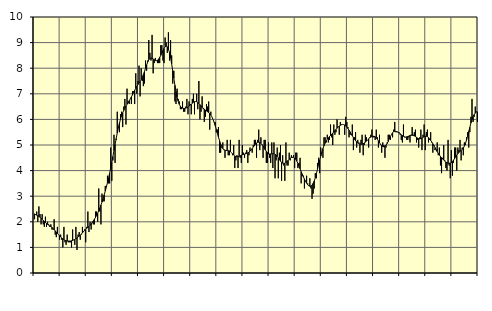
| Category | Piggar | Series 1 |
|---|---|---|
| nan | 2.1 | 2.31 |
| 87.0 | 2.3 | 2.28 |
| 87.0 | 2.4 | 2.26 |
| 87.0 | 2 | 2.24 |
| 87.0 | 2.6 | 2.21 |
| 87.0 | 2.3 | 2.18 |
| 87.0 | 1.9 | 2.14 |
| 87.0 | 2.3 | 2.1 |
| 87.0 | 1.9 | 2.05 |
| 87.0 | 1.8 | 2.01 |
| 87.0 | 2.2 | 1.97 |
| 87.0 | 1.8 | 1.93 |
| nan | 2 | 1.9 |
| 88.0 | 1.9 | 1.87 |
| 88.0 | 1.8 | 1.84 |
| 88.0 | 1.9 | 1.81 |
| 88.0 | 1.7 | 1.78 |
| 88.0 | 1.7 | 1.74 |
| 88.0 | 2.1 | 1.69 |
| 88.0 | 1.5 | 1.65 |
| 88.0 | 1.4 | 1.6 |
| 88.0 | 1.8 | 1.55 |
| 88.0 | 1.5 | 1.5 |
| 88.0 | 1.3 | 1.45 |
| nan | 1.5 | 1.41 |
| 89.0 | 1.3 | 1.37 |
| 89.0 | 1 | 1.33 |
| 89.0 | 1.8 | 1.3 |
| 89.0 | 1.2 | 1.28 |
| 89.0 | 1.1 | 1.26 |
| 89.0 | 1.5 | 1.25 |
| 89.0 | 1.2 | 1.25 |
| 89.0 | 1.2 | 1.25 |
| 89.0 | 1.2 | 1.25 |
| 89.0 | 1 | 1.26 |
| 89.0 | 1.7 | 1.27 |
| nan | 1.3 | 1.29 |
| 90.0 | 1.1 | 1.31 |
| 90.0 | 1.8 | 1.34 |
| 90.0 | 0.9 | 1.37 |
| 90.0 | 1.5 | 1.41 |
| 90.0 | 1.6 | 1.44 |
| 90.0 | 1.3 | 1.48 |
| 90.0 | 1.5 | 1.52 |
| 90.0 | 1.8 | 1.57 |
| 90.0 | 1.6 | 1.62 |
| 90.0 | 1.7 | 1.67 |
| 90.0 | 1.2 | 1.71 |
| nan | 1.8 | 1.75 |
| 91.0 | 2.4 | 1.78 |
| 91.0 | 1.6 | 1.82 |
| 91.0 | 2 | 1.86 |
| 91.0 | 1.7 | 1.91 |
| 91.0 | 2 | 1.97 |
| 91.0 | 1.9 | 2.03 |
| 91.0 | 1.9 | 2.1 |
| 91.0 | 2.4 | 2.17 |
| 91.0 | 2.4 | 2.25 |
| 91.0 | 2 | 2.34 |
| 91.0 | 3.3 | 2.43 |
| nan | 2.4 | 2.54 |
| 92.0 | 1.9 | 2.65 |
| 92.0 | 3.1 | 2.77 |
| 92.0 | 2.8 | 2.9 |
| 92.0 | 2.8 | 3.05 |
| 92.0 | 3.4 | 3.2 |
| 92.0 | 3.4 | 3.36 |
| 92.0 | 3.8 | 3.53 |
| 92.0 | 3.5 | 3.71 |
| 92.0 | 3.5 | 3.9 |
| 92.0 | 4.9 | 4.11 |
| 92.0 | 3.6 | 4.32 |
| nan | 4.4 | 4.55 |
| 93.0 | 5.4 | 4.78 |
| 93.0 | 4.3 | 5.02 |
| 93.0 | 5.2 | 5.25 |
| 93.0 | 6.3 | 5.47 |
| 93.0 | 5.7 | 5.67 |
| 93.0 | 5.5 | 5.85 |
| 93.0 | 6.2 | 6.01 |
| 93.0 | 6.3 | 6.14 |
| 93.0 | 5.7 | 6.26 |
| 93.0 | 6.5 | 6.35 |
| 93.0 | 6.8 | 6.44 |
| nan | 5.8 | 6.52 |
| 94.0 | 7.2 | 6.59 |
| 94.0 | 6.7 | 6.66 |
| 94.0 | 6.6 | 6.73 |
| 94.0 | 6.8 | 6.8 |
| 94.0 | 6.6 | 6.88 |
| 94.0 | 7.1 | 6.96 |
| 94.0 | 7.1 | 7.05 |
| 94.0 | 6.6 | 7.13 |
| 94.0 | 7.8 | 7.22 |
| 94.0 | 7 | 7.29 |
| 94.0 | 7.5 | 7.36 |
| nan | 8.1 | 7.42 |
| 95.0 | 6.9 | 7.48 |
| 95.0 | 8 | 7.55 |
| 95.0 | 7.5 | 7.64 |
| 95.0 | 7.3 | 7.75 |
| 95.0 | 7.4 | 7.87 |
| 95.0 | 8.3 | 8 |
| 95.0 | 7.9 | 8.13 |
| 95.0 | 8.3 | 8.24 |
| 95.0 | 9.1 | 8.33 |
| 95.0 | 8.6 | 8.38 |
| 95.0 | 8.3 | 8.4 |
| nan | 9.3 | 8.39 |
| 96.0 | 7.8 | 8.36 |
| 96.0 | 8.2 | 8.33 |
| 96.0 | 8.4 | 8.3 |
| 96.0 | 8.3 | 8.29 |
| 96.0 | 8.2 | 8.31 |
| 96.0 | 8.2 | 8.35 |
| 96.0 | 8.2 | 8.42 |
| 96.0 | 8.9 | 8.5 |
| 96.0 | 8.9 | 8.59 |
| 96.0 | 8.3 | 8.69 |
| 96.0 | 8.2 | 8.77 |
| nan | 9.2 | 8.84 |
| 97.0 | 9 | 8.86 |
| 97.0 | 8.6 | 8.84 |
| 97.0 | 9.4 | 8.75 |
| 97.0 | 8.3 | 8.61 |
| 97.0 | 9.1 | 8.41 |
| 97.0 | 8.5 | 8.17 |
| 97.0 | 7.4 | 7.89 |
| 97.0 | 7.9 | 7.61 |
| 97.0 | 6.7 | 7.33 |
| 97.0 | 6.6 | 7.08 |
| 97.0 | 7.2 | 6.87 |
| nan | 6.8 | 6.71 |
| 98.0 | 6.7 | 6.59 |
| 98.0 | 6.4 | 6.51 |
| 98.0 | 6.4 | 6.47 |
| 98.0 | 6.7 | 6.44 |
| 98.0 | 6.3 | 6.43 |
| 98.0 | 6.3 | 6.43 |
| 98.0 | 6.5 | 6.44 |
| 98.0 | 6.8 | 6.46 |
| 98.0 | 6.2 | 6.48 |
| 98.0 | 6.7 | 6.52 |
| 98.0 | 6.6 | 6.56 |
| nan | 6.2 | 6.59 |
| 99.0 | 6.8 | 6.63 |
| 99.0 | 7 | 6.67 |
| 99.0 | 6.2 | 6.69 |
| 99.0 | 6.7 | 6.7 |
| 99.0 | 7 | 6.69 |
| 99.0 | 6.4 | 6.66 |
| 99.0 | 7.5 | 6.62 |
| 99.0 | 6 | 6.58 |
| 99.0 | 6.3 | 6.53 |
| 99.0 | 6.9 | 6.48 |
| 99.0 | 6.4 | 6.44 |
| nan | 5.9 | 6.4 |
| 0.0 | 6.1 | 6.36 |
| 0.0 | 6.6 | 6.33 |
| 0.0 | 6.5 | 6.3 |
| 0.0 | 6.7 | 6.27 |
| 0.0 | 5.6 | 6.23 |
| 0.0 | 6.3 | 6.17 |
| 0.0 | 6.1 | 6.1 |
| 0.0 | 6 | 6 |
| 0.0 | 5.9 | 5.89 |
| 0.0 | 5.9 | 5.76 |
| 0.0 | 5.5 | 5.61 |
| nan | 5.6 | 5.46 |
| 1.0 | 5.7 | 5.31 |
| 1.0 | 4.7 | 5.17 |
| 1.0 | 4.7 | 5.04 |
| 1.0 | 4.9 | 4.94 |
| 1.0 | 5.1 | 4.86 |
| 1.0 | 4.8 | 4.82 |
| 1.0 | 4.5 | 4.79 |
| 1.0 | 4.8 | 4.79 |
| 1.0 | 5.2 | 4.79 |
| 1.0 | 4.6 | 4.78 |
| 1.0 | 4.6 | 4.77 |
| nan | 5.2 | 4.74 |
| 2.0 | 4.7 | 4.7 |
| 2.0 | 4.6 | 4.65 |
| 2.0 | 5 | 4.61 |
| 2.0 | 4.1 | 4.57 |
| 2.0 | 4.4 | 4.55 |
| 2.0 | 4.6 | 4.54 |
| 2.0 | 4.1 | 4.55 |
| 2.0 | 5.2 | 4.56 |
| 2.0 | 4.5 | 4.58 |
| 2.0 | 4.3 | 4.6 |
| 2.0 | 5 | 4.62 |
| nan | 4.7 | 4.63 |
| 3.0 | 4.5 | 4.64 |
| 3.0 | 4.7 | 4.66 |
| 3.0 | 4.8 | 4.67 |
| 3.0 | 4.3 | 4.69 |
| 3.0 | 4.6 | 4.72 |
| 3.0 | 4.9 | 4.76 |
| 3.0 | 4.8 | 4.81 |
| 3.0 | 4.7 | 4.86 |
| 3.0 | 5 | 4.92 |
| 3.0 | 5.2 | 4.98 |
| 3.0 | 5.2 | 5.03 |
| nan | 4.5 | 5.08 |
| 4.0 | 5.2 | 5.1 |
| 4.0 | 5.6 | 5.11 |
| 4.0 | 4.8 | 5.1 |
| 4.0 | 5.3 | 5.07 |
| 4.0 | 5 | 5.02 |
| 4.0 | 4.5 | 4.96 |
| 4.0 | 5.2 | 4.89 |
| 4.0 | 5.2 | 4.81 |
| 4.0 | 4.3 | 4.75 |
| 4.0 | 4.3 | 4.7 |
| 4.0 | 5.1 | 4.66 |
| nan | 4.5 | 4.65 |
| 5.0 | 4.3 | 4.65 |
| 5.0 | 5.1 | 4.65 |
| 5.0 | 4.1 | 4.66 |
| 5.0 | 5.1 | 4.66 |
| 5.0 | 3.7 | 4.64 |
| 5.0 | 4.4 | 4.61 |
| 5.0 | 4.9 | 4.56 |
| 5.0 | 3.7 | 4.5 |
| 5.0 | 4.7 | 4.43 |
| 5.0 | 5 | 4.37 |
| 5.0 | 3.6 | 4.32 |
| nan | 4.6 | 4.29 |
| 6.0 | 4.2 | 4.28 |
| 6.0 | 3.6 | 4.29 |
| 6.0 | 5.1 | 4.32 |
| 6.0 | 4.2 | 4.36 |
| 6.0 | 4.2 | 4.4 |
| 6.0 | 4.7 | 4.44 |
| 6.0 | 4.4 | 4.48 |
| 6.0 | 4.6 | 4.51 |
| 6.0 | 4.5 | 4.52 |
| 6.0 | 4.6 | 4.52 |
| 6.0 | 4.1 | 4.49 |
| nan | 4.7 | 4.44 |
| 7.0 | 4.7 | 4.37 |
| 7.0 | 4.1 | 4.28 |
| 7.0 | 4.3 | 4.18 |
| 7.0 | 4.5 | 4.07 |
| 7.0 | 3.5 | 3.96 |
| 7.0 | 3.8 | 3.86 |
| 7.0 | 3.8 | 3.76 |
| 7.0 | 3.3 | 3.67 |
| 7.0 | 3.6 | 3.58 |
| 7.0 | 3.8 | 3.51 |
| 7.0 | 3.5 | 3.45 |
| nan | 3.4 | 3.4 |
| 8.0 | 3.7 | 3.39 |
| 8.0 | 3.3 | 3.39 |
| 8.0 | 2.9 | 3.43 |
| 8.0 | 3.1 | 3.5 |
| 8.0 | 3.3 | 3.59 |
| 8.0 | 3.9 | 3.72 |
| 8.0 | 3.7 | 3.88 |
| 8.0 | 4.3 | 4.05 |
| 8.0 | 4.5 | 4.23 |
| 8.0 | 3.9 | 4.41 |
| 8.0 | 4.9 | 4.57 |
| nan | 4.7 | 4.72 |
| 9.0 | 4.5 | 4.86 |
| 9.0 | 5.3 | 4.97 |
| 9.0 | 5.3 | 5.07 |
| 9.0 | 5.1 | 5.16 |
| 9.0 | 5.4 | 5.23 |
| 9.0 | 5.1 | 5.28 |
| 9.0 | 5.2 | 5.33 |
| 9.0 | 5.8 | 5.38 |
| 9.0 | 5.3 | 5.42 |
| 9.0 | 5 | 5.46 |
| 9.0 | 5.8 | 5.51 |
| nan | 5.4 | 5.56 |
| 10.0 | 5.5 | 5.61 |
| 10.0 | 6 | 5.66 |
| 10.0 | 5.7 | 5.7 |
| 10.0 | 5.4 | 5.74 |
| 10.0 | 5.9 | 5.77 |
| 10.0 | 5.8 | 5.79 |
| 10.0 | 5.8 | 5.8 |
| 10.0 | 5.8 | 5.8 |
| 10.0 | 5.4 | 5.78 |
| 10.0 | 6.1 | 5.74 |
| 10.0 | 5.9 | 5.7 |
| nan | 5.7 | 5.64 |
| 11.0 | 5.3 | 5.58 |
| 11.0 | 5.4 | 5.51 |
| 11.0 | 5.4 | 5.43 |
| 11.0 | 5.8 | 5.36 |
| 11.0 | 4.8 | 5.29 |
| 11.0 | 5.3 | 5.22 |
| 11.0 | 5.5 | 5.17 |
| 11.0 | 4.9 | 5.12 |
| 11.0 | 5.2 | 5.08 |
| 11.0 | 5.1 | 5.06 |
| 11.0 | 4.7 | 5.04 |
| nan | 5.2 | 5.03 |
| 12.0 | 5.4 | 5.03 |
| 12.0 | 4.6 | 5.05 |
| 12.0 | 5 | 5.08 |
| 12.0 | 5.4 | 5.11 |
| 12.0 | 5.3 | 5.15 |
| 12.0 | 5.2 | 5.2 |
| 12.0 | 4.9 | 5.24 |
| 12.0 | 5.3 | 5.28 |
| 12.0 | 5.4 | 5.31 |
| 12.0 | 5.6 | 5.33 |
| 12.0 | 5.3 | 5.34 |
| nan | 5.3 | 5.34 |
| 13.0 | 5.2 | 5.32 |
| 13.0 | 5.6 | 5.28 |
| 13.0 | 5.3 | 5.23 |
| 13.0 | 4.9 | 5.16 |
| 13.0 | 5.4 | 5.09 |
| 13.0 | 5 | 5.02 |
| 13.0 | 4.7 | 4.97 |
| 13.0 | 5.1 | 4.94 |
| 13.0 | 5 | 4.93 |
| 13.0 | 4.5 | 4.95 |
| 13.0 | 4.9 | 4.99 |
| nan | 5.1 | 5.06 |
| 14.0 | 5.4 | 5.14 |
| 14.0 | 5.4 | 5.24 |
| 14.0 | 5.2 | 5.33 |
| 14.0 | 5.4 | 5.41 |
| 14.0 | 5.3 | 5.48 |
| 14.0 | 5.6 | 5.52 |
| 14.0 | 5.9 | 5.53 |
| 14.0 | 5.5 | 5.53 |
| 14.0 | 5.5 | 5.52 |
| 14.0 | 5.5 | 5.5 |
| 14.0 | 5.5 | 5.47 |
| nan | 5.4 | 5.44 |
| 15.0 | 5.2 | 5.4 |
| 15.0 | 5.1 | 5.37 |
| 15.0 | 5.8 | 5.34 |
| 15.0 | 5.3 | 5.32 |
| 15.0 | 5.3 | 5.31 |
| 15.0 | 5.2 | 5.32 |
| 15.0 | 5.2 | 5.33 |
| 15.0 | 5.3 | 5.35 |
| 15.0 | 5.1 | 5.37 |
| 15.0 | 5.4 | 5.38 |
| 15.0 | 5.7 | 5.38 |
| nan | 5.4 | 5.37 |
| 16.0 | 5.5 | 5.36 |
| 16.0 | 5.6 | 5.33 |
| 16.0 | 5.1 | 5.3 |
| 16.0 | 5.2 | 5.27 |
| 16.0 | 4.9 | 5.25 |
| 16.0 | 5.3 | 5.24 |
| 16.0 | 5.6 | 5.25 |
| 16.0 | 4.8 | 5.27 |
| 16.0 | 5.4 | 5.3 |
| 16.0 | 5.8 | 5.33 |
| 16.0 | 4.8 | 5.34 |
| nan | 5.5 | 5.34 |
| 17.0 | 5.6 | 5.33 |
| 17.0 | 5.1 | 5.29 |
| 17.0 | 5.2 | 5.24 |
| 17.0 | 5.5 | 5.18 |
| 17.0 | 5.1 | 5.12 |
| 17.0 | 4.7 | 5.05 |
| 17.0 | 5 | 4.97 |
| 17.0 | 4.8 | 4.9 |
| 17.0 | 4.8 | 4.82 |
| 17.0 | 5.1 | 4.74 |
| 17.0 | 4.6 | 4.67 |
| nan | 4.9 | 4.61 |
| 18.0 | 4.2 | 4.55 |
| 18.0 | 3.9 | 4.5 |
| 18.0 | 4.5 | 4.46 |
| 18.0 | 5 | 4.41 |
| 18.0 | 4.4 | 4.37 |
| 18.0 | 4.1 | 4.33 |
| 18.0 | 4 | 4.31 |
| 18.0 | 5.2 | 4.29 |
| 18.0 | 4.2 | 4.29 |
| 18.0 | 3.7 | 4.29 |
| 18.0 | 4.8 | 4.31 |
| nan | 3.8 | 4.35 |
| 19.0 | 4.3 | 4.41 |
| 19.0 | 4.9 | 4.47 |
| 19.0 | 4.9 | 4.54 |
| 19.0 | 4 | 4.6 |
| 19.0 | 4.9 | 4.66 |
| 19.0 | 4.8 | 4.71 |
| 19.0 | 5.2 | 4.76 |
| 19.0 | 4.4 | 4.79 |
| 19.0 | 4.9 | 4.83 |
| 19.0 | 4.6 | 4.88 |
| 19.0 | 5.1 | 4.96 |
| nan | 5 | 5.07 |
| 20.0 | 5.3 | 5.2 |
| 20.0 | 5.5 | 5.36 |
| 20.0 | 4.9 | 5.53 |
| 20.0 | 5.5 | 5.69 |
| 20.0 | 6.1 | 5.86 |
| 20.0 | 6.8 | 6 |
| 20.0 | 5.9 | 6.11 |
| 20.0 | 6.1 | 6.19 |
| 20.0 | 6.5 | 6.25 |
| 20.0 | 6.3 | 6.29 |
| 20.0 | 5.9 | 6.3 |